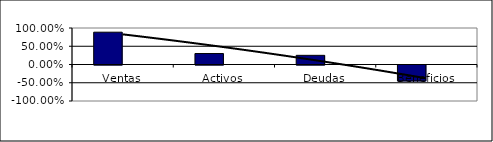
| Category | Series 0 | Series 1 |
|---|---|---|
| Ventas | 0.885 |  |
| Activos | 0.3 |  |
| Deudas | 0.251 |  |
| Beneficios | -0.437 |  |